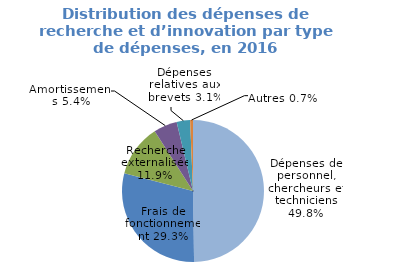
| Category | Series 0 |
|---|---|
| Dépenses de personnel, chercheurs et techniciens | 0.498 |
| Frais de fonctionnement | 0.293 |
| Recherche externalisée | 0.119 |
| Amortissements | 0.054 |
| Dépenses relatives aux brevets | 0.03 |
| Autres | 0.006 |